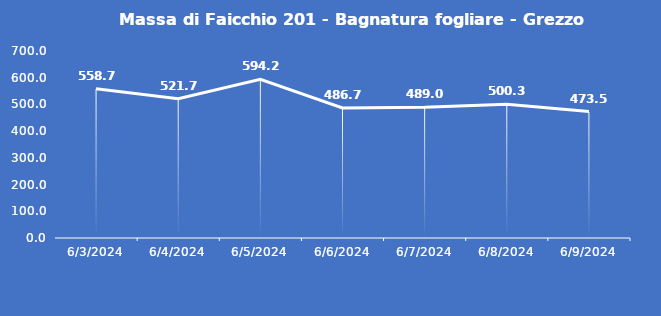
| Category | Massa di Faicchio 201 - Bagnatura fogliare - Grezzo (min) |
|---|---|
| 6/3/24 | 558.7 |
| 6/4/24 | 521.7 |
| 6/5/24 | 594.2 |
| 6/6/24 | 486.7 |
| 6/7/24 | 489 |
| 6/8/24 | 500.3 |
| 6/9/24 | 473.5 |